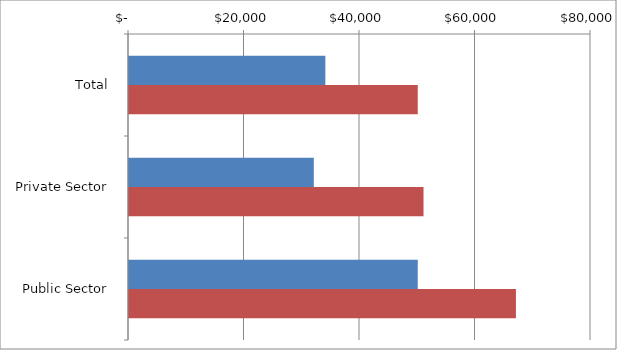
| Category | Series 0 | Series 1 |
|---|---|---|
| Total | 34000 | 50000 |
|  Private Sector  | 32000 | 51000 |
|  Public Sector  | 50000 | 67000 |